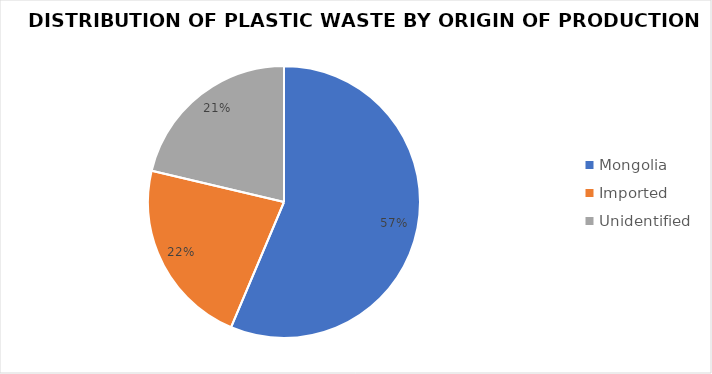
| Category | Series 0 |
|---|---|
| Mongolia | 278.84 |
| Imported | 110.488 |
| Unidentified | 105.39 |